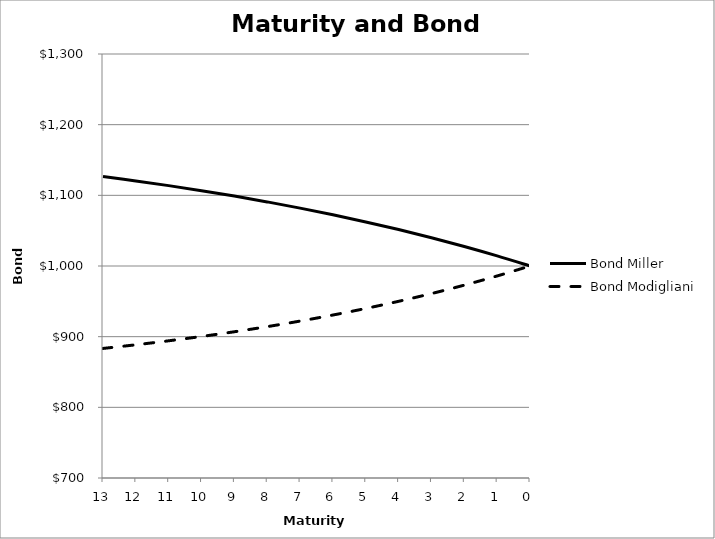
| Category | Bond Miller | Bond Modigliani |
|---|---|---|
| 13.0 | 1126.678 | 883.329 |
| 12.0 | 1120.438 | 888.519 |
| 11.0 | 1113.753 | 894.161 |
| 10.0 | 1106.593 | 900.292 |
| 9.0 | 1098.923 | 906.956 |
| 8.0 | 1090.706 | 914.198 |
| 7.0 | 1081.904 | 922.068 |
| 6.0 | 1072.475 | 930.622 |
| 5.0 | 1062.375 | 939.918 |
| 4.0 | 1051.555 | 950.022 |
| 3.0 | 1039.964 | 961.002 |
| 2.0 | 1027.548 | 972.935 |
| 1.0 | 1014.248 | 985.905 |
| 0.0 | 1000 | 1000 |